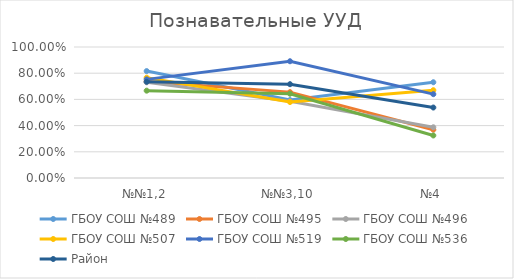
| Category | ГБОУ СОШ №489 | ГБОУ СОШ №495 | ГБОУ СОШ №496 | ГБОУ СОШ №507 | ГБОУ СОШ №519 | ГБОУ СОШ №536 | Район |
|---|---|---|---|---|---|---|---|
| №№1,2 | 0.816 | 0.737 | 0.73 | 0.766 | 0.753 | 0.667 | 0.735 |
| №№3,10 | 0.595 | 0.656 | 0.585 | 0.58 | 0.891 | 0.643 | 0.716 |
| №4 | 0.731 | 0.369 | 0.387 | 0.67 | 0.64 | 0.325 | 0.538 |